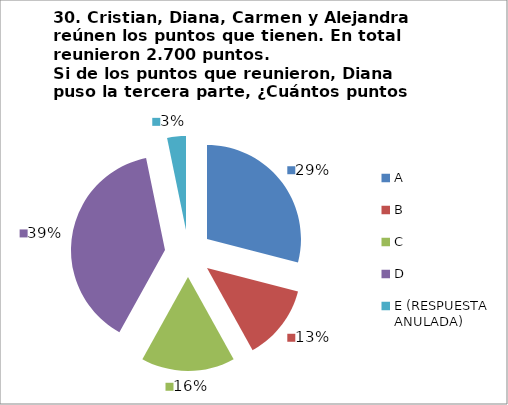
| Category | CANTIDAD DE RESPUESTAS PREGUNTA (30) | PORCENTAJE |
|---|---|---|
| A | 9 | 0.29 |
| B | 4 | 0.129 |
| C | 5 | 0.161 |
| D | 12 | 0.387 |
| E (RESPUESTA ANULADA) | 1 | 0.032 |